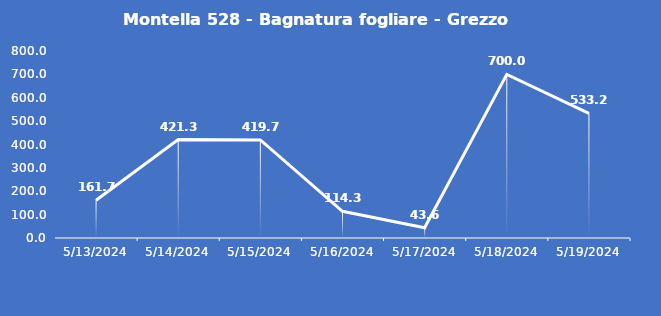
| Category | Montella 528 - Bagnatura fogliare - Grezzo (min) |
|---|---|
| 5/13/24 | 161.7 |
| 5/14/24 | 421.3 |
| 5/15/24 | 419.7 |
| 5/16/24 | 114.3 |
| 5/17/24 | 43.6 |
| 5/18/24 | 700 |
| 5/19/24 | 533.2 |